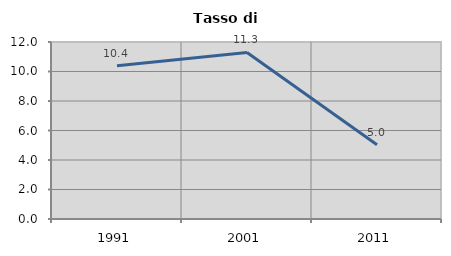
| Category | Tasso di disoccupazione   |
|---|---|
| 1991.0 | 10.396 |
| 2001.0 | 11.29 |
| 2011.0 | 5.036 |